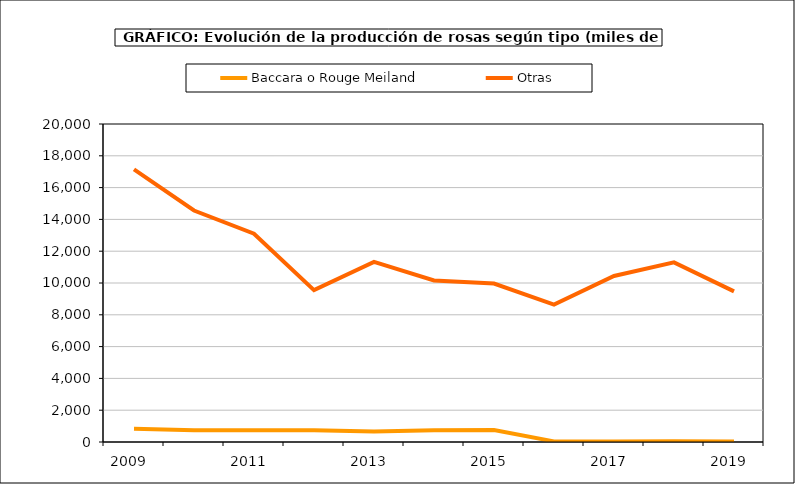
| Category | Baccara o Rouge Meiland | Otras |
|---|---|---|
| 2009.0 | 836 | 17147 |
| 2010.0 | 741 | 14560 |
| 2011.0 | 741 | 13099 |
| 2012.0 | 741 | 9551 |
| 2013.0 | 662 | 11331 |
| 2014.0 | 739 | 10158 |
| 2015.0 | 756 | 9969 |
| 2016.0 | 38 | 8644 |
| 2017.0 | 38 | 10442 |
| 2018.0 | 43 | 11297 |
| 2019.0 | 39 | 9474 |